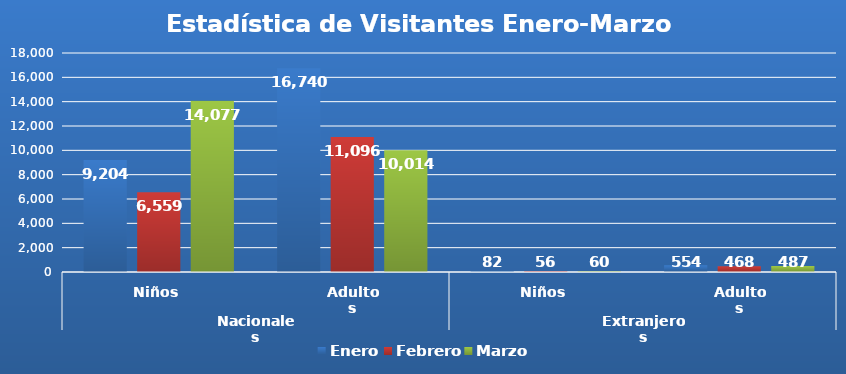
| Category | Enero | Febrero | Marzo |
|---|---|---|---|
| 0 | 9204 | 6559 | 14077 |
| 1 | 16740 | 11096 | 10014 |
| 2 | 82 | 56 | 60 |
| 3 | 554 | 468 | 487 |